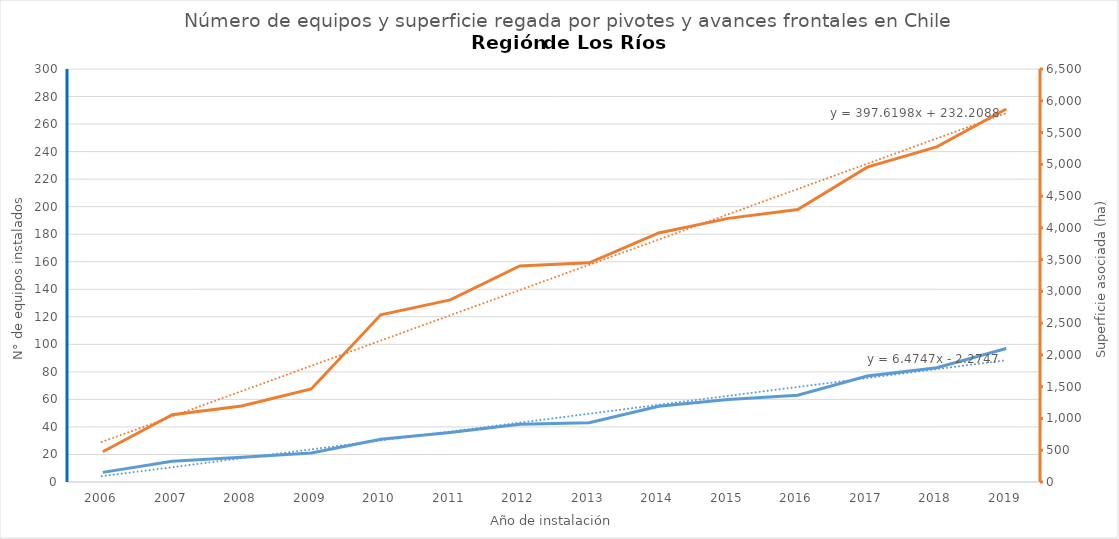
| Category | N° |
|---|---|
| 2006.0 | 7 |
| 2007.0 | 15 |
| 2008.0 | 18 |
| 2009.0 | 21 |
| 2010.0 | 31 |
| 2011.0 | 36 |
| 2012.0 | 42 |
| 2013.0 | 43 |
| 2014.0 | 55 |
| 2015.0 | 60 |
| 2016.0 | 63 |
| 2017.0 | 77 |
| 2018.0 | 83 |
| 2019.0 | 97 |